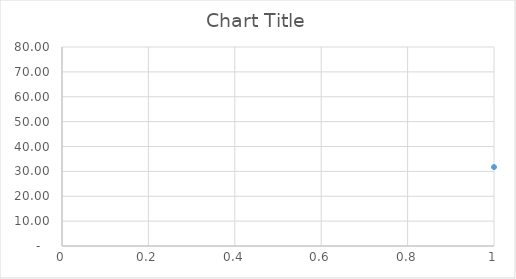
| Category | Series 0 |
|---|---|
| 0 | 31.73 |
| 1 | 15.95 |
| 2 | 8.25 |
| 3 | 16.31 |
| 4 | 16.96 |
| 5 | 18.62 |
| 6 | 12.54 |
| 7 | 28.45 |
| 8 | 1.36 |
| 9 | 6.44 |
| 10 | 43.1 |
| 11 | 15.9 |
| 12 | 13.07 |
| 13 | 10.38 |
| 14 | 10.35 |
| 15 | 0 |
| 16 | 10.32 |
| 17 | 18.59 |
| 18 | 25.34 |
| 19 | 28.69 |
| 20 | 9.77 |
| 21 | 46.57 |
| 22 | 22.72 |
| 23 | 14.69 |
| 24 | 10.38 |
| 25 | 8.79 |
| 26 | 26.41 |
| 27 | 0 |
| 28 | 20.04 |
| 29 | 19.55 |
| 30 | 14.24 |
| 31 | 18.25 |
| 32 | 25.7 |
| 33 | 44.2 |
| 34 | 18.02 |
| 35 | 8.35 |
| 36 | 18.3 |
| 37 | 33.89 |
| 38 | 45.46 |
| 39 | 15.39 |
| 40 | 19.4 |
| 41 | 5.32 |
| 42 | 22.68 |
| 43 | 16.38 |
| 44 | 26.65 |
| 45 | 38.62 |
| 46 | 20.03 |
| 47 | 27.51 |
| 48 | 44.15 |
| 49 | 2.9 |
| 50 | 25.46 |
| 51 | 13.49 |
| 52 | 48.25 |
| 53 | 24.43 |
| 54 | 0 |
| 55 | 14.68 |
| 56 | 23.66 |
| 57 | 0.02 |
| 58 | 14.19 |
| 59 | 18.46 |
| 60 | 21.08 |
| 61 | 25.29 |
| 62 | 9.99 |
| 63 | 29.35 |
| 64 | 36.49 |
| 65 | 25.97 |
| 66 | 47.68 |
| 67 | 7.98 |
| 68 | 28.88 |
| 69 | 48.58 |
| 70 | 48.23 |
| 71 | 27.2 |
| 72 | 18.51 |
| 73 | 31.87 |
| 74 | 18.56 |
| 75 | 24.7 |
| 76 | 36.81 |
| 77 | 10.91 |
| 78 | 16.03 |
| 79 | 7.58 |
| 80 | 14.29 |
| 81 | 48.67 |
| 82 | 12.72 |
| 83 | 33.74 |
| 84 | 9.32 |
| 85 | 28.8 |
| 86 | 11.39 |
| 87 | 8.44 |
| 88 | 30.81 |
| 89 | 31.4 |
| 90 | 50.24 |
| 91 | 12.85 |
| 92 | 24.66 |
| 93 | 31.1 |
| 94 | 13.7 |
| 95 | 6.37 |
| 96 | 31.06 |
| 97 | 45.64 |
| 98 | 32.5 |
| 99 | 49.87 |
| 100 | 24.82 |
| 101 | 29.73 |
| 102 | 18.09 |
| 103 | 31.95 |
| 104 | 21.81 |
| 105 | 51.72 |
| 106 | 0.12 |
| 107 | 12.53 |
| 108 | 18.91 |
| 109 | 29.25 |
| 110 | 27.48 |
| 111 | 0 |
| 112 | 33.81 |
| 113 | 31.08 |
| 114 | 15.1 |
| 115 | 31.25 |
| 116 | 0.13 |
| 117 | 13.41 |
| 118 | 13.32 |
| 119 | 0.41 |
| 120 | 39.75 |
| 121 | 54.24 |
| 122 | 17.66 |
| 123 | 32.86 |
| 124 | 0 |
| 125 | 13.8 |
| 126 | 21.95 |
| 127 | 22.15 |
| 128 | 13.88 |
| 129 | 16.11 |
| 130 | 15.61 |
| 131 | 12.49 |
| 132 | 19.46 |
| 133 | 4.95 |
| 134 | 52.94 |
| 135 | 34.37 |
| 136 | 10.24 |
| 137 | 32.47 |
| 138 | 35.06 |
| 139 | 3.82 |
| 140 | 35.12 |
| 141 | 5.3 |
| 142 | 31.78 |
| 143 | 8.29 |
| 144 | 15.01 |
| 145 | 16.31 |
| 146 | 5.33 |
| 147 | 40.93 |
| 148 | 2.98 |
| 149 | 51.83 |
| 150 | 35.32 |
| 151 | 15.89 |
| 152 | 16.81 |
| 153 | 7.55 |
| 154 | 16.34 |
| 155 | 20.63 |
| 156 | 34.02 |
| 157 | 18.55 |
| 158 | 30.32 |
| 159 | 32.06 |
| 160 | 14.4 |
| 161 | 35.33 |
| 162 | 17.1 |
| 163 | 54.38 |
| 164 | 25 |
| 165 | 12.95 |
| 166 | 0 |
| 167 | 37.33 |
| 168 | 4.59 |
| 169 | 11.98 |
| 170 | 35.5 |
| 171 | 13.1 |
| 172 | 17.67 |
| 173 | 36.04 |
| 174 | 17.79 |
| 175 | 17.48 |
| 176 | 17.97 |
| 177 | 15.53 |
| 178 | 55.78 |
| 179 | 16.79 |
| 180 | 36.3 |
| 181 | 36.82 |
| 182 | 16.49 |
| 183 | 17.94 |
| 184 | 35 |
| 185 | 36.62 |
| 186 | 54.46 |
| 187 | 18.93 |
| 188 | 32.51 |
| 189 | 0 |
| 190 | 2.98 |
| 191 | 6.06 |
| 192 | 33.7 |
| 193 | 2.14 |
| 194 | 18.78 |
| 195 | 32.93 |
| 196 | 0.69 |
| 197 | 36.35 |
| 198 | 18.79 |
| 199 | 56.91 |
| 200 | 57.28 |
| 201 | 35.83 |
| 202 | 57.29 |
| 203 | 52.51 |
| 204 | 54.17 |
| 205 | 19.38 |
| 206 | 2.23 |
| 207 | 0 |
| 208 | 19.21 |
| 209 | 17.28 |
| 210 | 19 |
| 211 | 22.06 |
| 212 | 19.63 |
| 213 | 0 |
| 214 | 0 |
| 215 | 0 |
| 216 | 0 |
| 217 | 0 |
| 218 | 0 |
| 219 | 0 |
| 220 | 0 |
| 221 | 0 |
| 222 | 16.81 |
| 223 | 22.46 |
| 224 | 19.91 |
| 225 | 18.21 |
| 226 | 38.09 |
| 227 | 34.6 |
| 228 | 38.07 |
| 229 | 19.23 |
| 230 | 36.7 |
| 231 | 19.76 |
| 232 | 19.63 |
| 233 | 19.3 |
| 234 | 37.73 |
| 235 | 38.08 |
| 236 | 17.85 |
| 237 | 20.25 |
| 238 | 16.93 |
| 239 | 20.38 |
| 240 | 38.79 |
| 241 | 32.95 |
| 242 | 37.85 |
| 243 | 35.96 |
| 244 | 20.38 |
| 245 | 20.28 |
| 246 | 20.34 |
| 247 | 20.04 |
| 248 | 20.18 |
| 249 | 19.84 |
| 250 | 37.17 |
| 251 | 31.63 |
| 252 | 20.44 |
| 253 | 33.32 |
| 254 | 20.49 |
| 255 | 20.57 |
| 256 | 19.54 |
| 257 | 29.84 |
| 258 | 18.91 |
| 259 | 35.65 |
| 260 | 38.44 |
| 261 | 20.58 |
| 262 | 39.11 |
| 263 | 38.55 |
| 264 | 21.16 |
| 265 | 31.76 |
| 266 | 38.45 |
| 267 | 20.65 |
| 268 | 20.44 |
| 269 | 20.14 |
| 270 | 38.62 |
| 271 | 39.05 |
| 272 | 26 |
| 273 | 37.86 |
| 274 | 21.07 |
| 275 | 38.5 |
| 276 | 38.77 |
| 277 | 21.21 |
| 278 | 20.37 |
| 279 | 38.78 |
| 280 | 38.48 |
| 281 | 36.87 |
| 282 | 38.04 |
| 283 | 21.08 |
| 284 | 38.45 |
| 285 | 37.62 |
| 286 | 20.44 |
| 287 | 38.81 |
| 288 | 21.21 |
| 289 | 21.33 |
| 290 | 39.52 |
| 291 | 21.27 |
| 292 | 20.82 |
| 293 | 42.87 |
| 294 | 21.18 |
| 295 | 38.69 |
| 296 | 39.83 |
| 297 | 39.24 |
| 298 | 37.35 |
| 299 | 21.38 |
| 300 | 40.16 |
| 301 | 21.4 |
| 302 | 39.23 |
| 303 | 39.94 |
| 304 | 59 |
| 305 | 21.21 |
| 306 | 21.39 |
| 307 | 57.22 |
| 308 | 54.75 |
| 309 | 38.75 |
| 310 | 39.16 |
| 311 | 39.74 |
| 312 | 56.85 |
| 313 | 36.15 |
| 314 | 39.65 |
| 315 | 22.35 |
| 316 | 22.64 |
| 317 | 21.64 |
| 318 | 40.21 |
| 319 | 39.18 |
| 320 | 40.66 |
| 321 | 39.29 |
| 322 | 39.93 |
| 323 | 30.24 |
| 324 | 22.17 |
| 325 | 40.24 |
| 326 | 40.64 |
| 327 | 40.67 |
| 328 | 40.81 |
| 329 | 40.95 |
| 330 | 22.45 |
| 331 | 23.05 |
| 332 | 39.94 |
| 333 | 40.87 |
| 334 | 40.33 |
| 335 | 23.49 |
| 336 | 40.81 |
| 337 | 39.06 |
| 338 | 41.55 |
| 339 | 40.94 |
| 340 | 41.33 |
| 341 | 31.21 |
| 342 | 21.78 |
| 343 | 40.99 |
| 344 | 23.47 |
| 345 | 39.57 |
| 346 | 58.83 |
| 347 | 23.04 |
| 348 | 40.65 |
| 349 | 61.45 |
| 350 | 41.74 |
| 351 | 41.93 |
| 352 | 40.38 |
| 353 | 42.06 |
| 354 | 41.57 |
| 355 | 40.2 |
| 356 | 42.14 |
| 357 | 42.06 |
| 358 | 60.87 |
| 359 | 36.12 |
| 360 | 40.66 |
| 361 | 43.21 |
| 362 | 41.83 |
| 363 | 42.67 |
| 364 | 40.99 |
| 365 | 34.62 |
| 366 | 42.73 |
| 367 | 60.71 |
| 368 | 42.28 |
| 369 | 40.59 |
| 370 | 42.91 |
| 371 | 42.72 |
| 372 | 40.93 |
| 373 | 44.28 |
| 374 | 41.59 |
| 375 | 43 |
| 376 | 43.42 |
| 377 | 40.35 |
| 378 | 43.75 |
| 379 | 43.59 |
| 380 | 42.96 |
| 381 | 45.13 |
| 382 | 43.21 |
| 383 | 43.88 |
| 384 | 43.1 |
| 385 | 43.65 |
| 386 | 43.98 |
| 387 | 43.66 |
| 388 | 43.31 |
| 389 | 43.58 |
| 390 | 43.73 |
| 391 | 63.41 |
| 392 | 44.19 |
| 393 | 43.88 |
| 394 | 64.08 |
| 395 | 44.71 |
| 396 | 44.81 |
| 397 | 44.96 |
| 398 | 45.64 |
| 399 | 46.32 |
| 400 | 65.55 |
| 401 | 45.91 |
| 402 | 46.17 |
| 403 | 65.93 |
| 404 | 67.22 |
| 405 | 70.34 |
| 406 | 70.89 |